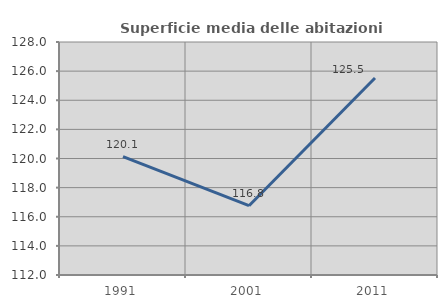
| Category | Superficie media delle abitazioni occupate |
|---|---|
| 1991.0 | 120.127 |
| 2001.0 | 116.76 |
| 2011.0 | 125.533 |